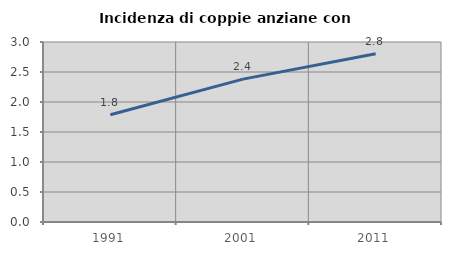
| Category | Incidenza di coppie anziane con figli |
|---|---|
| 1991.0 | 1.787 |
| 2001.0 | 2.381 |
| 2011.0 | 2.805 |